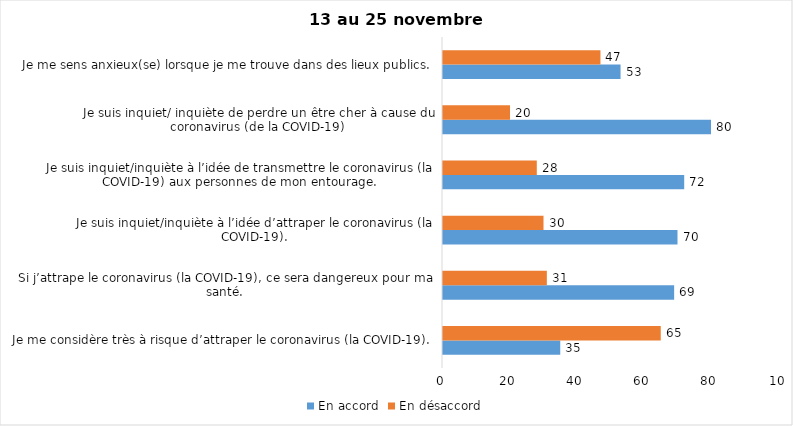
| Category | En accord | En désaccord |
|---|---|---|
| Je me considère très à risque d’attraper le coronavirus (la COVID-19). | 35 | 65 |
| Si j’attrape le coronavirus (la COVID-19), ce sera dangereux pour ma santé. | 69 | 31 |
| Je suis inquiet/inquiète à l’idée d’attraper le coronavirus (la COVID-19). | 70 | 30 |
| Je suis inquiet/inquiète à l’idée de transmettre le coronavirus (la COVID-19) aux personnes de mon entourage. | 72 | 28 |
| Je suis inquiet/ inquiète de perdre un être cher à cause du coronavirus (de la COVID-19) | 80 | 20 |
| Je me sens anxieux(se) lorsque je me trouve dans des lieux publics. | 53 | 47 |